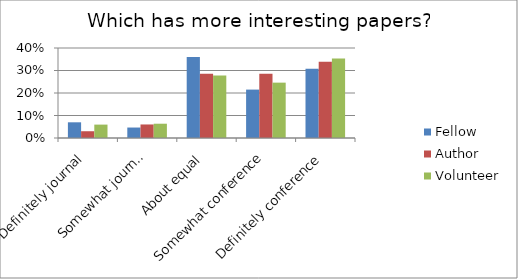
| Category | Fellow | Author | Volunteer |
|---|---|---|---|
| Definitely journal | 0.07 | 0.03 | 0.06 |
| Somewhat journal | 0.047 | 0.06 | 0.063 |
| About equal | 0.36 | 0.286 | 0.278 |
| Somewhat conference | 0.215 | 0.286 | 0.246 |
| Definitely conference | 0.308 | 0.338 | 0.353 |